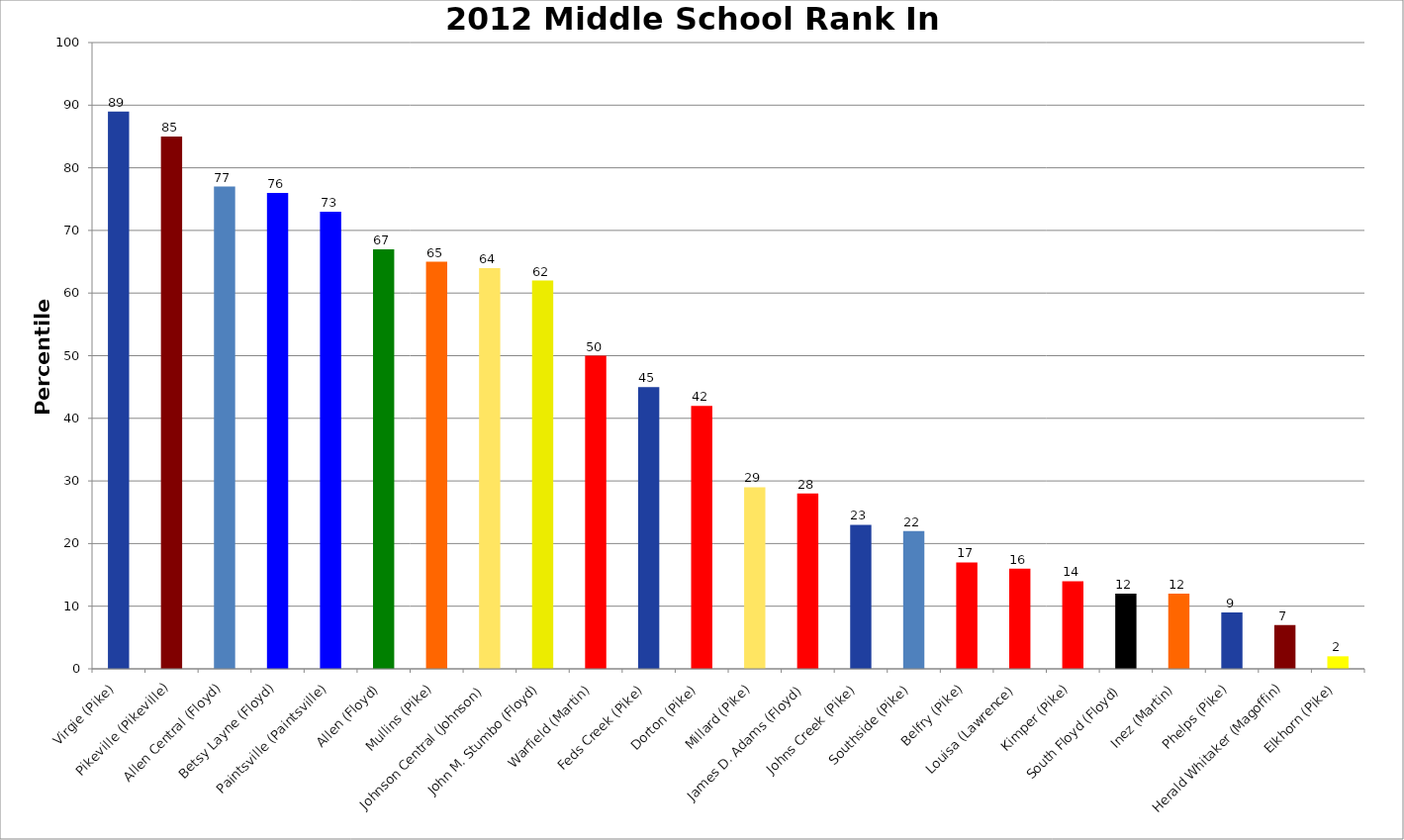
| Category | Series 0 |
|---|---|
| Virgie (Pike) | 89 |
| Pikeville (Pikeville) | 85 |
| Allen Central (Floyd) | 77 |
| Betsy Layne (Floyd) | 76 |
| Paintsville (Paintsville) | 73 |
| Allen (Floyd) | 67 |
| Mullins (Pike) | 65 |
| Johnson Central (Johnson) | 64 |
| John M. Stumbo (Floyd) | 62 |
| Warfield (Martin) | 50 |
| Feds Creek (Pike) | 45 |
| Dorton (Pike) | 42 |
| Millard (Pike) | 29 |
| James D. Adams (Floyd) | 28 |
| Johns Creek (Pike) | 23 |
| Southside (Pike) | 22 |
| Belfry (Pike) | 17 |
| Louisa (Lawrence) | 16 |
| Kimper (Pike) | 14 |
| South Floyd (Floyd) | 12 |
| Inez (Martin) | 12 |
| Phelps (Pike) | 9 |
| Herald Whitaker (Magoffin) | 7 |
| Elkhorn (Pike) | 2 |